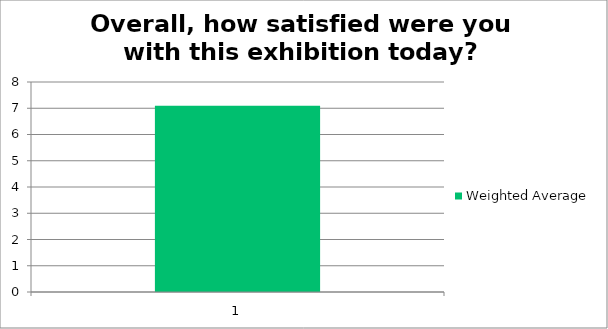
| Category | Weighted Average |
|---|---|
| 1.0 | 7.1 |